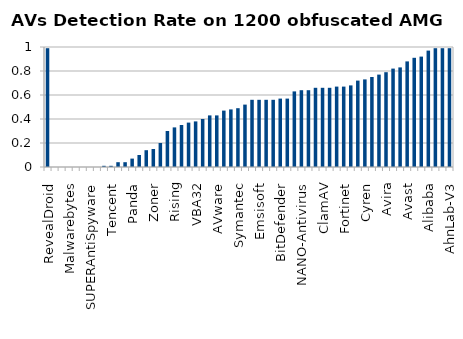
| Category | Series 0 |
|---|---|
| RevealDroid | 0.99 |
| Bkav | 0 |
| CMC | 0 |
| Malwarebytes | 0 |
| TheHacker | 0 |
| ViRobot | 0 |
| SUPERAntiSpyware | 0 |
| ByteHero | 0 |
| K7AntiVirus | 0.01 |
| Tencent | 0.01 |
| nProtect | 0.04 |
| Agnitum | 0.04 |
| Panda | 0.07 |
| ALYac | 0.1 |
| McAfee-GW-Edition | 0.14 |
| Zoner | 0.15 |
| TotalDefense | 0.2 |
| Kingsoft | 0.3 |
| Rising | 0.33 |
| Jiangmin | 0.35 |
| McAfee | 0.37 |
| VBA32 | 0.38 |
| Antiy-AVL | 0.4 |
| VIPRE | 0.43 |
| AVware | 0.43 |
| Zillya | 0.47 |
| AegisLab | 0.48 |
| Symantec | 0.49 |
| Baidu-International | 0.52 |
| MicroWorld-eScan | 0.56 |
| Emsisoft | 0.56 |
| Arcabit | 0.56 |
| Microsoft | 0.56 |
| BitDefender | 0.57 |
| Ad-Aware | 0.57 |
| Qihoo-360 | 0.63 |
| NANO-Antivirus | 0.64 |
| F-Prot | 0.64 |
| TrendMicro-HouseCall | 0.66 |
| ClamAV | 0.66 |
| Comodo | 0.66 |
| GData | 0.67 |
| Fortinet | 0.67 |
| TrendMicro | 0.68 |
| CAT-QuickHeal | 0.72 |
| Cyren | 0.73 |
| F-Secure | 0.75 |
| Sophos | 0.77 |
| Avira | 0.79 |
| AVG | 0.82 |
| Ikarus | 0.83 |
| Avast | 0.88 |
| ESET-NOD32 | 0.91 |
| DrWeb | 0.92 |
| Alibaba | 0.97 |
| K7GW | 0.99 |
| Kaspersky | 0.99 |
| AhnLab-V3 | 0.99 |